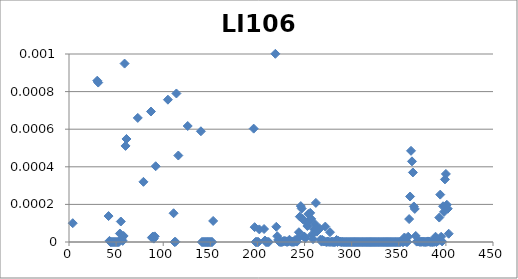
| Category |  LI106  |
|---|---|
| 0 | 0.017 |
| 1 | 0.012 |
| 2 | 0.008 |
| 3 | 0 |
| 4 | 0.014 |
| 5 | 0.01 |
| 6 | 0.013 |
| 7 | 0.019 |
| 8 | 0.015 |
| 9 | 0.013 |
| 10 | 0.016 |
| 11 | 0.022 |
| 12 | 0.015 |
| 13 | 0.008 |
| 14 | 0.006 |
| 15 | 0.003 |
| 16 | 0.001 |
| 17 | 0.003 |
| 18 | 0.004 |
| 19 | 0.004 |
| 20 | 0.007 |
| 21 | 0.006 |
| 22 | 0.004 |
| 23 | 0.003 |
| 24 | 0.003 |
| 25 | 0.003 |
| 26 | 0.005 |
| 27 | 0.001 |
| 28 | 0.001 |
| 29 | 0.001 |
| 30 | 0.001 |
| 31 | 0.001 |
| 32 | 0.001 |
| 33 | 0.003 |
| 34 | 0.001 |
| 35 | 0.001 |
| 36 | 0.001 |
| 37 | 0.002 |
| 38 | 0.003 |
| 39 | 0.005 |
| 40 | 0.003 |
| 41 | 0 |
| 42 | 0 |
| 43 | 0 |
| 44 | 0 |
| 45 | 0 |
| 46 | 0 |
| 47 | 0 |
| 48 | 0 |
| 49 | 0 |
| 50 | 0 |
| 51 | 0 |
| 52 | 0 |
| 53 | 0 |
| 54 | 0 |
| 55 | 0 |
| 56 | 0 |
| 57 | 0 |
| 58 | 0.001 |
| 59 | 0.001 |
| 60 | 0.001 |
| 61 | 0.002 |
| 62 | 0.004 |
| 63 | 0.002 |
| 64 | 0.001 |
| 65 | 0.004 |
| 66 | 0.006 |
| 67 | 0.006 |
| 68 | 0.005 |
| 69 | 0.005 |
| 70 | 0.006 |
| 71 | 0.002 |
| 72 | 0.001 |
| 73 | 0.002 |
| 74 | 0.006 |
| 75 | 0.007 |
| 76 | 0.006 |
| 77 | 0.001 |
| 78 | 0 |
| 79 | 0.003 |
| 80 | 0.004 |
| 81 | 0.003 |
| 82 | 0.005 |
| 83 | 0.006 |
| 84 | 0.005 |
| 85 | 0.005 |
| 86 | 0.001 |
| 87 | 0 |
| 88 | 0 |
| 89 | 0 |
| 90 | 0 |
| 91 | 0 |
| 92 | 0.002 |
| 93 | 0.004 |
| 94 | 0.004 |
| 95 | 0.004 |
| 96 | 0.003 |
| 97 | 0.003 |
| 98 | 0.003 |
| 99 | 0.003 |
| 100 | 0.003 |
| 101 | 0.003 |
| 102 | 0.004 |
| 103 | 0.003 |
| 104 | 0.001 |
| 105 | 0.003 |
| 106 | 0.002 |
| 107 | 0.003 |
| 108 | 0.003 |
| 109 | 0.003 |
| 110 | 0 |
| 111 | 0 |
| 112 | 0 |
| 113 | 0.001 |
| 114 | 0.002 |
| 115 | 0 |
| 116 | 0.001 |
| 117 | 0.002 |
| 118 | 0.002 |
| 119 | 0.002 |
| 120 | 0.001 |
| 121 | 0.003 |
| 122 | 0.002 |
| 123 | 0.002 |
| 124 | 0.001 |
| 125 | 0.001 |
| 126 | 0.003 |
| 127 | 0.002 |
| 128 | 0.001 |
| 129 | 0.001 |
| 130 | 0.002 |
| 131 | 0.001 |
| 132 | 0.002 |
| 133 | 0.003 |
| 134 | 0.003 |
| 135 | 0.003 |
| 136 | 0.003 |
| 137 | 0.003 |
| 138 | 0.001 |
| 139 | 0.001 |
| 140 | 0 |
| 141 | 0 |
| 142 | 0 |
| 143 | 0 |
| 144 | 0 |
| 145 | 0 |
| 146 | 0 |
| 147 | 0 |
| 148 | 0 |
| 149 | 0 |
| 150 | 0 |
| 151 | 0 |
| 152 | 0 |
| 153 | 0.004 |
| 154 | 0.003 |
| 155 | 0.004 |
| 156 | 0.007 |
| 157 | 0.006 |
| 158 | 0.005 |
| 159 | 0.004 |
| 160 | 0.004 |
| 161 | 0.005 |
| 162 | 0.003 |
| 163 | 0.005 |
| 164 | 0.006 |
| 165 | 0.003 |
| 166 | 0.003 |
| 167 | 0.008 |
| 168 | 0.008 |
| 169 | 0.006 |
| 170 | 0.004 |
| 171 | 0.003 |
| 172 | 0.002 |
| 173 | 0.004 |
| 174 | 0.004 |
| 175 | 0.005 |
| 176 | 0.004 |
| 177 | 0.004 |
| 178 | 0.003 |
| 179 | 0.003 |
| 180 | 0.003 |
| 181 | 0.003 |
| 182 | 0.004 |
| 183 | 0.003 |
| 184 | 0.003 |
| 185 | 0.004 |
| 186 | 0.002 |
| 187 | 0.003 |
| 188 | 0.002 |
| 189 | 0.003 |
| 190 | 0.003 |
| 191 | 0.003 |
| 192 | 0.003 |
| 193 | 0.003 |
| 194 | 0.003 |
| 195 | 0.001 |
| 196 | 0 |
| 197 | 0 |
| 198 | 0 |
| 199 | 0 |
| 200 | 0 |
| 201 | 0 |
| 202 | 0.002 |
| 203 | 0.002 |
| 204 | 0.002 |
| 205 | 0.002 |
| 206 | 0 |
| 207 | 0 |
| 208 | 0 |
| 209 | 0 |
| 210 | 0 |
| 211 | 0 |
| 212 | 0.002 |
| 213 | 0.002 |
| 214 | 0.003 |
| 215 | 0.003 |
| 216 | 0.002 |
| 217 | 0.001 |
| 218 | 0.001 |
| 219 | 0 |
| 220 | 0 |
| 221 | 0 |
| 222 | 0 |
| 223 | 0 |
| 224 | 0 |
| 225 | 0 |
| 226 | 0 |
| 227 | 0 |
| 228 | 0 |
| 229 | 0 |
| 230 | 0 |
| 231 | 0 |
| 232 | 0 |
| 233 | 0 |
| 234 | 0 |
| 235 | 0 |
| 236 | 0 |
| 237 | 0 |
| 238 | 0 |
| 239 | 0 |
| 240 | 0 |
| 241 | 0 |
| 242 | 0 |
| 243 | 0 |
| 244 | 0 |
| 245 | 0 |
| 246 | 0 |
| 247 | 0 |
| 248 | 0 |
| 249 | 0 |
| 250 | 0 |
| 251 | 0 |
| 252 | 0 |
| 253 | 0 |
| 254 | 0 |
| 255 | 0 |
| 256 | 0 |
| 257 | 0 |
| 258 | 0 |
| 259 | 0 |
| 260 | 0 |
| 261 | 0 |
| 262 | 0 |
| 263 | 0 |
| 264 | 0 |
| 265 | 0 |
| 266 | 0 |
| 267 | 0 |
| 268 | 0 |
| 269 | 0 |
| 270 | 0 |
| 271 | 0 |
| 272 | 0 |
| 273 | 0 |
| 274 | 0 |
| 275 | 0 |
| 276 | 0 |
| 277 | 0 |
| 278 | 0 |
| 279 | 0 |
| 280 | 0 |
| 281 | 0 |
| 282 | 0 |
| 283 | 0 |
| 284 | 0 |
| 285 | 0 |
| 286 | 0 |
| 287 | 0 |
| 288 | 0 |
| 289 | 0 |
| 290 | 0 |
| 291 | 0 |
| 292 | 0 |
| 293 | 0 |
| 294 | 0 |
| 295 | 0 |
| 296 | 0 |
| 297 | 0 |
| 298 | 0 |
| 299 | 0 |
| 300 | 0 |
| 301 | 0 |
| 302 | 0 |
| 303 | 0 |
| 304 | 0 |
| 305 | 0 |
| 306 | 0 |
| 307 | 0 |
| 308 | 0 |
| 309 | 0 |
| 310 | 0 |
| 311 | 0 |
| 312 | 0 |
| 313 | 0 |
| 314 | 0 |
| 315 | 0 |
| 316 | 0 |
| 317 | 0 |
| 318 | 0 |
| 319 | 0 |
| 320 | 0 |
| 321 | 0 |
| 322 | 0 |
| 323 | 0 |
| 324 | 0 |
| 325 | 0 |
| 326 | 0 |
| 327 | 0 |
| 328 | 0 |
| 329 | 0 |
| 330 | 0 |
| 331 | 0 |
| 332 | 0 |
| 333 | 0 |
| 334 | 0 |
| 335 | 0 |
| 336 | 0 |
| 337 | 0 |
| 338 | 0 |
| 339 | 0 |
| 340 | 0 |
| 341 | 0 |
| 342 | 0 |
| 343 | 0 |
| 344 | 0 |
| 345 | 0 |
| 346 | 0 |
| 347 | 0 |
| 348 | 0 |
| 349 | 0 |
| 350 | 0 |
| 351 | 0 |
| 352 | 0.002 |
| 353 | 0 |
| 354 | 0 |
| 355 | 0 |
| 356 | 0 |
| 357 | 0 |
| 358 | 0 |
| 359 | 0 |
| 360 | 0 |
| 361 | 0 |
| 362 | 0 |
| 363 | 0 |
| 364 | 0 |
| 365 | 0 |
| 366 | 0 |
| 367 | 0 |
| 368 | 0 |
| 369 | 0 |
| 370 | 0 |
| 371 | 0 |
| 372 | 0 |
| 373 | 0 |
| 374 | 0 |
| 375 | 0 |
| 376 | 0 |
| 377 | 0 |
| 378 | 0 |
| 379 | 0 |
| 380 | 0 |
| 381 | 0 |
| 382 | 0 |
| 383 | 0 |
| 384 | 0 |
| 385 | 0 |
| 386 | 0 |
| 387 | 0 |
| 388 | 0 |
| 389 | 0 |
| 390 | 0 |
| 391 | 0 |
| 392 | 0 |
| 393 | 0 |
| 394 | 0 |
| 395 | 0 |
| 396 | 0 |
| 397 | 0 |
| 398 | 0 |
| 399 | 0 |
| 400 | 0 |
| 401 | 0 |
| 402 | 0 |